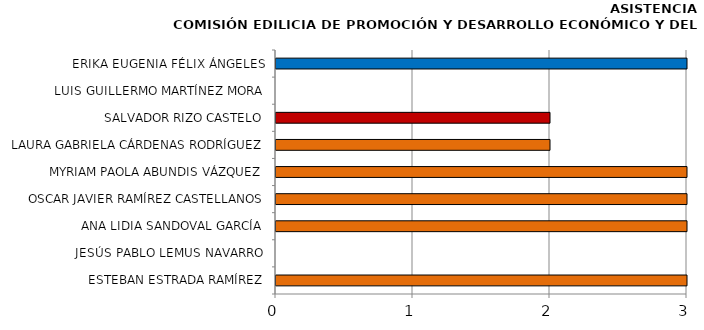
| Category | Series 0 |
|---|---|
| ESTEBAN ESTRADA RAMÍREZ | 3 |
| JESÚS PABLO LEMUS NAVARRO | 0 |
| ANA LIDIA SANDOVAL GARCÍA | 3 |
| OSCAR JAVIER RAMÍREZ CASTELLANOS | 3 |
| MYRIAM PAOLA ABUNDIS VÁZQUEZ | 3 |
| LAURA GABRIELA CÁRDENAS RODRÍGUEZ | 2 |
| SALVADOR RIZO CASTELO | 2 |
| LUIS GUILLERMO MARTÍNEZ MORA | 0 |
| ERIKA EUGENIA FÉLIX ÁNGELES | 3 |